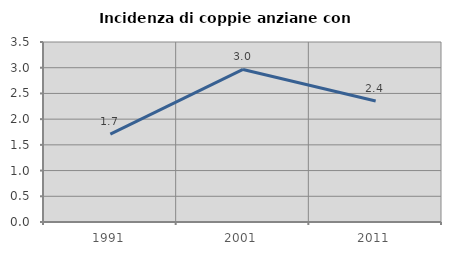
| Category | Incidenza di coppie anziane con figli |
|---|---|
| 1991.0 | 1.709 |
| 2001.0 | 2.966 |
| 2011.0 | 2.353 |